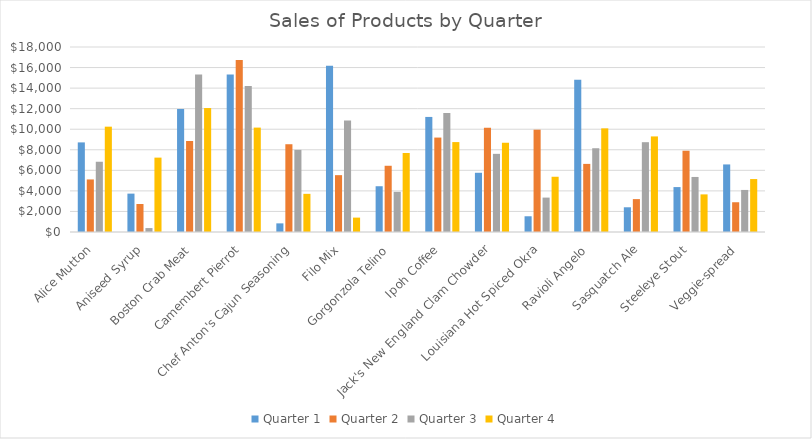
| Category | Quarter 1 | Quarter 2 | Quarter 3 | Quarter 4 |
|---|---|---|---|---|
| Alice Mutton | 8718 | 5113 | 6835 | 10248 |
| Aniseed Syrup | 3734 | 2723 | 383 | 7237 |
| Boston Crab Meat | 11971 | 8856 | 15336 | 12061 |
| Camembert Pierrot | 15313 | 16741 | 14217 | 10158 |
| Chef Anton's Cajun Seasoning | 840 | 8540 | 7991 | 3713 |
| Filo Mix | 16182 | 5531 | 10856 | 1400 |
| Gorgonzola Telino | 4453 | 6444 | 3910 | 7688 |
| Ipoh Coffee | 11196 | 9188 | 11578 | 8748 |
| Jack's New England Clam Chowder | 5762 | 10147 | 7604 | 8682 |
| Louisiana Hot Spiced Okra | 1531 | 9956 | 3348 | 5375 |
| Ravioli Angelo | 14820 | 6627 | 8150 | 10084 |
| Sasquatch Ale | 2405 | 3200 | 8738 | 9300 |
| Steeleye Stout | 4370 | 7907 | 5355 | 3660 |
| Veggie-spread | 6574 | 2895 | 4092 | 5151 |